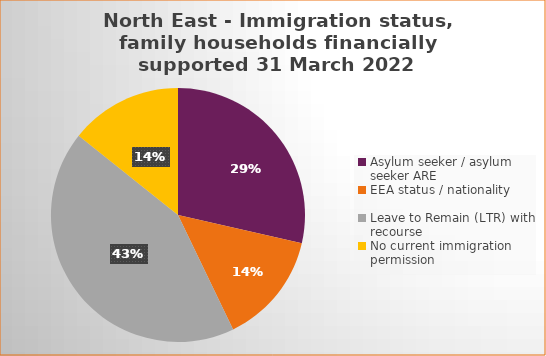
| Category | Number  | Percentage |
|---|---|---|
| Asylum seeker / asylum seeker ARE | 2 | 0.286 |
| EEA status / nationality  | 1 | 0.143 |
| Leave to Remain (LTR) with recourse | 3 | 0.429 |
| No current immigration permission | 1 | 0.143 |